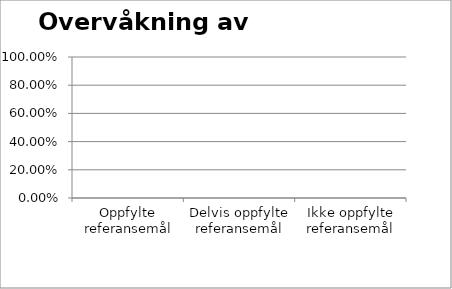
| Category | Overvåkning av miljø |
|---|---|
| Oppfylte referansemål | 0 |
| Delvis oppfylte referansemål | 0 |
| Ikke oppfylte referansemål | 0 |